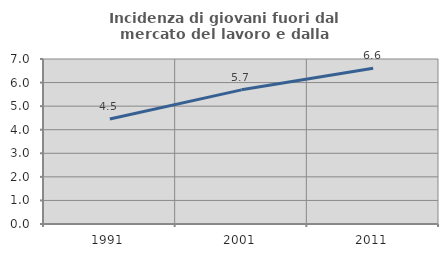
| Category | Incidenza di giovani fuori dal mercato del lavoro e dalla formazione  |
|---|---|
| 1991.0 | 4.455 |
| 2001.0 | 5.691 |
| 2011.0 | 6.605 |